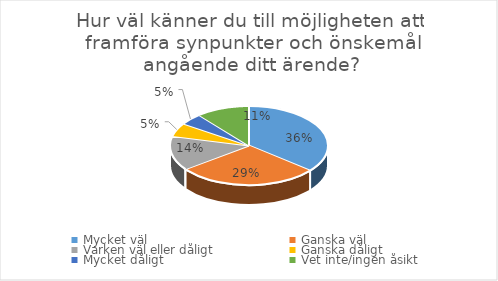
| Category | Hur väl känner du till möjligheten att framföra synpunkter och önskemål angående ditt ärende? |
|---|---|
| Mycket väl | 46 |
| Ganska väl | 37 |
| Varken väl eller dåligt | 18 |
| Ganska dåligt  | 7 |
| Mycket dåligt  | 6 |
| Vet inte/ingen åsikt | 14 |